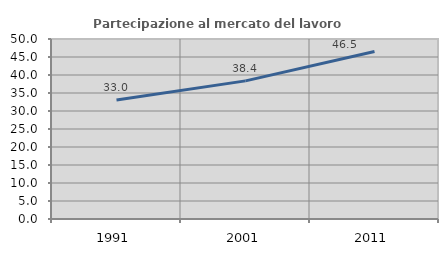
| Category | Partecipazione al mercato del lavoro  femminile |
|---|---|
| 1991.0 | 33.046 |
| 2001.0 | 38.368 |
| 2011.0 | 46.529 |